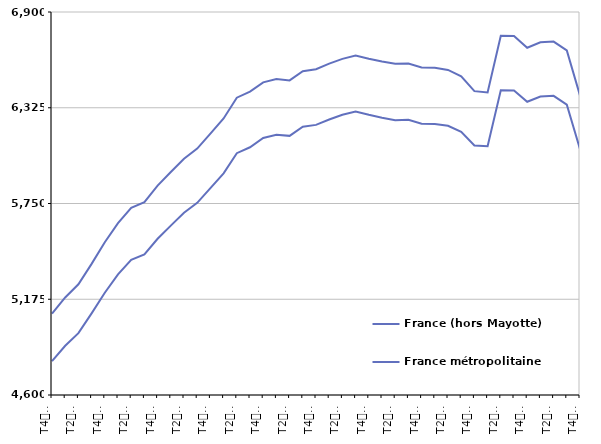
| Category | France (hors Mayotte) | France métropolitaine |
|---|---|---|
| T4
2011 | 5089.3 | 4803.3 |
| T1
2012 | 5185.8 | 4895.7 |
| T2
2012 | 5264.9 | 4971.6 |
| T3
2012 | 5387.5 | 5090.2 |
| T4
2012 | 5517.4 | 5214.1 |
| T1
2013 | 5632.5 | 5324.8 |
| T2
2013 | 5724 | 5411.2 |
| T3
2013 | 5758.2 | 5444.2 |
| T4
2013 | 5857.2 | 5538.1 |
| T1
2014 | 5939.2 | 5617.3 |
| T2
2014 | 6018.3 | 5694.7 |
| T3
2014 | 6079.7 | 5753.9 |
| T4
2014 | 6170.1 | 5842.8 |
| T1
2015 | 6260.5 | 5931.3 |
| T2
2015 | 6385.5 | 6052 |
| T3
2015 | 6422 | 6087.7 |
| T4
2015 | 6477.6 | 6143.5 |
| T1
2016 | 6498 | 6162.7 |
| T2
2016 | 6489 | 6156.2 |
| T3
2016 | 6544.6 | 6211.4 |
| T4
2016 | 6556.7 | 6222.1 |
| T1
2017 | 6590.2 | 6254.4 |
| T2
2017 | 6618.5 | 6282.8 |
| T3
2017 | 6638.5 | 6302.5 |
| T4
2017 | 6619 | 6282.4 |
| T1
2018 | 6602.2 | 6265.5 |
| T2
2018 | 6589.1 | 6250.5 |
| T3
2018 | 6590.7 | 6252.7 |
| T4
2018 | 6566.9 | 6229.6 |
| T1
2019 | 6565.5 | 6228.1 |
| T2
2019 | 6552.1 | 6216.5 |
| T3
2019 | 6513.9 | 6180.9 |
| T4
2019 | 6424.8 | 6098.1 |
| T1
2020 | 6416.8 | 6094.5 |
| T2
2020 | 6757.3 | 6430.5 |
| T3
2020 | 6756.3 | 6428.8 |
| T4
2020 | 6685.3 | 6361 |
| T1
2021 | 6717.8 | 6392.8 |
| T2
2021 | 6722.4 | 6396.5 |
| T3
2021 | 6668.8 | 6343.9 |
| T4
2021 | 6398.3 | 6076.3 |